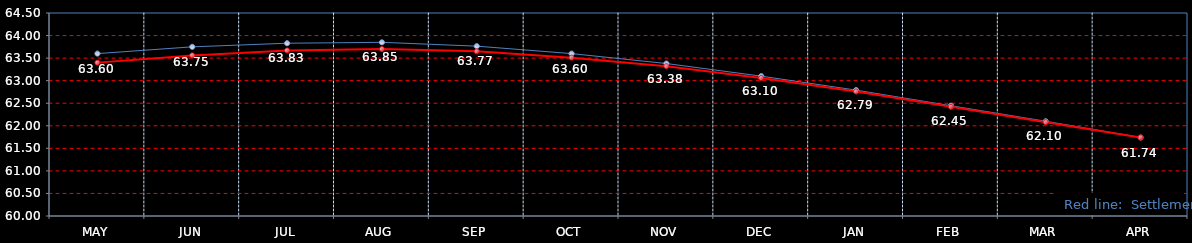
| Category | Last | Settlement |
|---|---|---|
| MAY | 63.6 | 63.4 |
| JUN | 63.75 | 63.56 |
| JUL | 63.83 | 63.67 |
| AUG | 63.85 | 63.7 |
| SEP | 63.765 | 63.65 |
| OCT | 63.6 | 63.51 |
| NOV | 63.38 | 63.32 |
| DEC | 63.1 | 63.06 |
| JAN | 62.79 | 62.76 |
| FEB | 62.445 | 62.42 |
| MAR | 62.1 | 62.08 |
| APR | 61.74 | 61.74 |